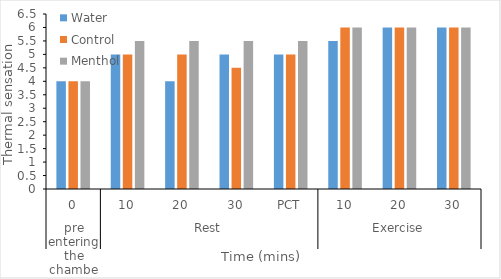
| Category | Water | Control | Menthol  |
|---|---|---|---|
| 0 | 4 | 4 | 4 |
| 1 | 5 | 5 | 5.5 |
| 2 | 4 | 5 | 5.5 |
| 3 | 5 | 4.5 | 5.5 |
| 4 | 5 | 5 | 5.5 |
| 5 | 5.5 | 6 | 6 |
| 6 | 6 | 6 | 6 |
| 7 | 6 | 6 | 6 |